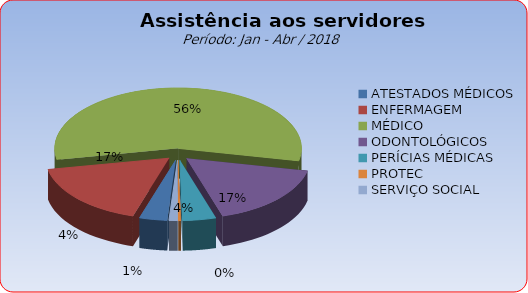
| Category | Series 0 |
|---|---|
| ATESTADOS MÉDICOS | 3.632 |
| ENFERMAGEM | 17.253 |
| MÉDICO | 56.3 |
| ODONTOLÓGICOS | 16.969 |
| PERÍCIAS MÉDICAS | 4.37 |
| PROTEC | 0.341 |
| SERVIÇO SOCIAL | 1.135 |